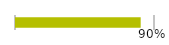
| Category | Series 0 |
|---|---|
| 0 | 0.897 |